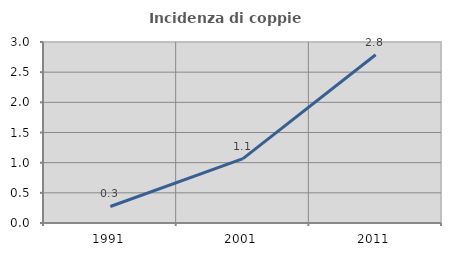
| Category | Incidenza di coppie miste |
|---|---|
| 1991.0 | 0.274 |
| 2001.0 | 1.068 |
| 2011.0 | 2.789 |